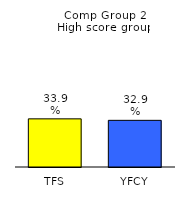
| Category | Series 0 |
|---|---|
| TFS | 0.339 |
| YFCY | 0.329 |